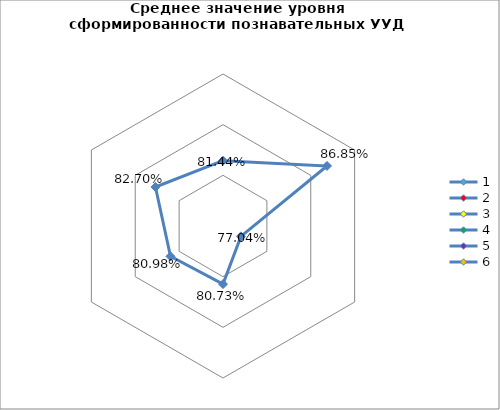
| Category | Series 0 |
|---|---|
| 0 | 0.814 |
| 1 | 0.869 |
| 2 | 0.77 |
| 3 | 0.807 |
| 4 | 0.81 |
| 5 | 0.827 |